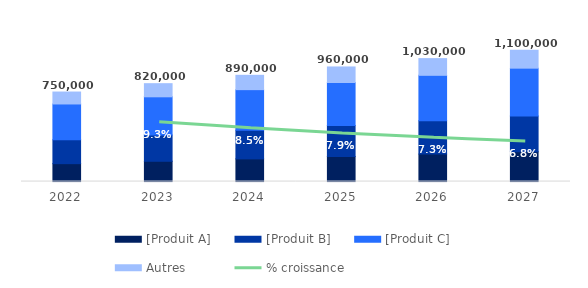
| Category | [Produit A] | [Produit B] | [Produit C] | Autres | Series 7 |
|---|---|---|---|---|---|
| 2022 | 150000 | 200000 | 300000 | 100000 | 750000 |
| 2023 | 170000 | 220000 | 320000 | 110000 | 820000 |
| 2024 | 190000 | 240000 | 340000 | 120000 | 890000 |
| 2025 | 210000 | 260000 | 360000 | 130000 | 960000 |
| 2026 | 230000 | 280000 | 380000 | 140000 | 1030000 |
| 2027 | 250000 | 300000 | 400000 | 150000 | 1100000 |